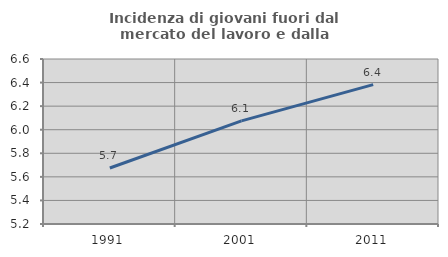
| Category | Incidenza di giovani fuori dal mercato del lavoro e dalla formazione  |
|---|---|
| 1991.0 | 5.675 |
| 2001.0 | 6.075 |
| 2011.0 | 6.383 |